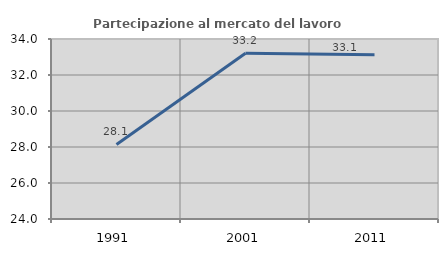
| Category | Partecipazione al mercato del lavoro  femminile |
|---|---|
| 1991.0 | 28.144 |
| 2001.0 | 33.212 |
| 2011.0 | 33.12 |